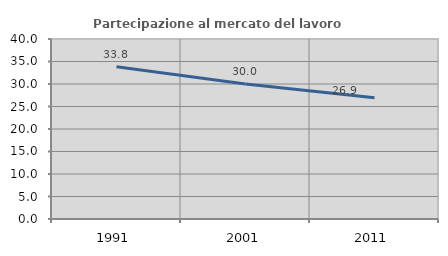
| Category | Partecipazione al mercato del lavoro  femminile |
|---|---|
| 1991.0 | 33.824 |
| 2001.0 | 30 |
| 2011.0 | 26.923 |